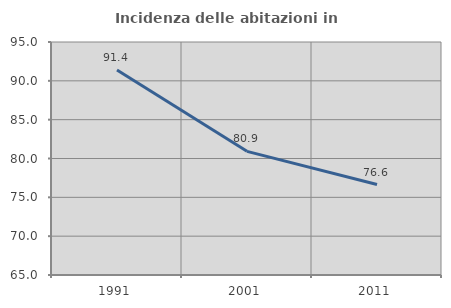
| Category | Incidenza delle abitazioni in proprietà  |
|---|---|
| 1991.0 | 91.393 |
| 2001.0 | 80.922 |
| 2011.0 | 76.65 |